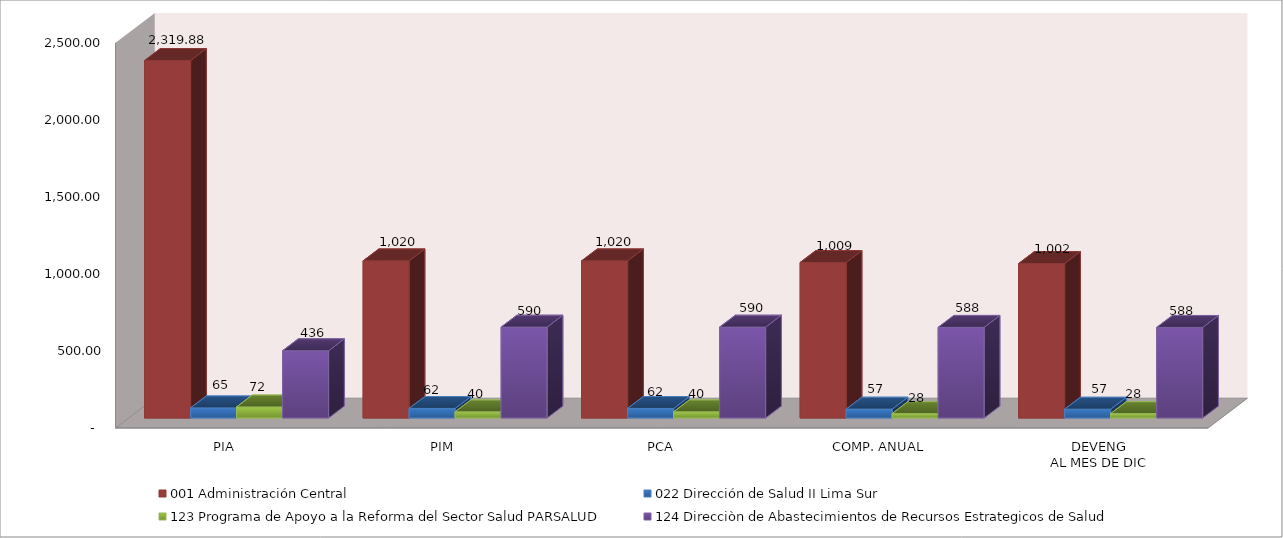
| Category | 001 Administración Central | 022 Dirección de Salud II Lima Sur | 123 Programa de Apoyo a la Reforma del Sector Salud PARSALUD | 124 Direcciòn de Abastecimientos de Recursos Estrategicos de Salud |
|---|---|---|---|---|
| PIA | 2319.877 | 65.372 | 71.532 | 436.35 |
| PIM | 1019.637 | 61.801 | 39.717 | 589.603 |
| PCA | 1019.637 | 61.801 | 39.717 | 589.603 |
| COMP. ANUAL | 1009.194 | 57.38 | 28.191 | 588.157 |
| DEVENG
AL MES DE DIC | 1002.259 | 57.02 | 28.191 | 587.747 |